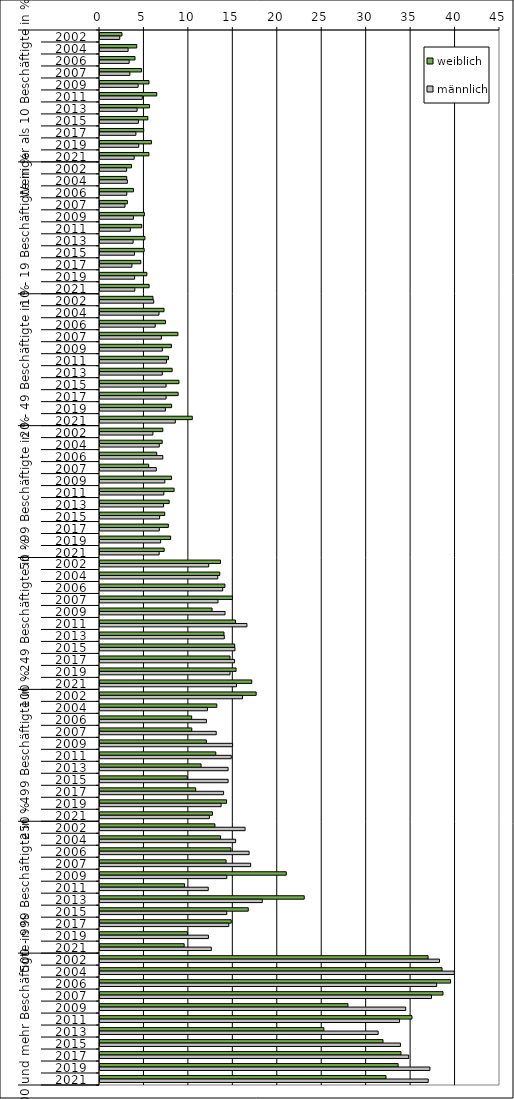
| Category | weiblich | männlich |
|---|---|---|
| 0 | 2.47 | 2.224 |
| 1 | 4.134 | 3.162 |
| 2 | 3.939 | 3.281 |
| 3 | 4.678 | 3.36 |
| 4 | 5.511 | 4.29 |
| 5 | 6.384 | 4.759 |
| 6 | 5.573 | 4.172 |
| 7 | 5.385 | 4.32 |
| 8 | 4.915 | 4.038 |
| 9 | 5.784 | 4.356 |
| 10 | 5.504 | 3.845 |
| 11 | 3.545 | 2.995 |
| 12 | 3.006 | 3.078 |
| 13 | 3.766 | 3.016 |
| 14 | 3.081 | 2.812 |
| 15 | 4.994 | 3.758 |
| 16 | 4.696 | 3.411 |
| 17 | 5.054 | 3.728 |
| 18 | 4.97 | 3.883 |
| 19 | 4.59 | 3.592 |
| 20 | 5.271 | 3.896 |
| 21 | 5.524 | 3.915 |
| 22 | 5.956 | 6.043 |
| 23 | 7.203 | 6.639 |
| 24 | 7.374 | 6.212 |
| 25 | 8.765 | 6.904 |
| 26 | 8.035 | 7.014 |
| 27 | 7.7 | 7.474 |
| 28 | 8.115 | 7.007 |
| 29 | 8.881 | 7.431 |
| 30 | 8.79 | 7.432 |
| 31 | 8.059 | 7.358 |
| 32 | 10.383 | 8.473 |
| 33 | 7.063 | 5.955 |
| 34 | 6.998 | 6.666 |
| 35 | 6.384 | 7.066 |
| 36 | 5.478 | 6.332 |
| 37 | 8.043 | 7.292 |
| 38 | 8.334 | 7.181 |
| 39 | 7.783 | 7.154 |
| 40 | 7.282 | 6.707 |
| 41 | 7.69 | 6.671 |
| 42 | 7.945 | 6.823 |
| 43 | 7.217 | 6.656 |
| 44 | 13.56 | 12.231 |
| 45 | 13.476 | 13.25 |
| 46 | 14.052 | 13.804 |
| 47 | 14.9 | 13.273 |
| 48 | 12.606 | 14.067 |
| 49 | 15.249 | 16.53 |
| 50 | 13.948 | 13.984 |
| 51 | 15.154 | 15.186 |
| 52 | 14.624 | 15.141 |
| 53 | 15.308 | 14.625 |
| 54 | 17.073 | 15.359 |
| 55 | 17.568 | 16.032 |
| 56 | 13.14 | 12.087 |
| 57 | 10.314 | 11.972 |
| 58 | 10.327 | 13.075 |
| 59 | 11.962 | 14.919 |
| 60 | 13.027 | 14.767 |
| 61 | 11.371 | 14.411 |
| 62 | 9.813 | 14.414 |
| 63 | 10.768 | 13.905 |
| 64 | 14.236 | 13.627 |
| 65 | 12.654 | 12.306 |
| 66 | 12.927 | 16.322 |
| 67 | 13.565 | 15.258 |
| 68 | 14.733 | 16.776 |
| 69 | 14.182 | 16.948 |
| 70 | 20.956 | 14.265 |
| 71 | 9.514 | 12.18 |
| 72 | 22.975 | 18.254 |
| 73 | 16.679 | 14.262 |
| 74 | 14.763 | 14.491 |
| 75 | 9.857 | 12.2 |
| 76 | 9.469 | 12.523 |
| 77 | 36.911 | 38.197 |
| 78 | 38.479 | 39.86 |
| 79 | 39.44 | 37.873 |
| 80 | 38.589 | 37.296 |
| 81 | 27.892 | 34.395 |
| 82 | 35.098 | 33.698 |
| 83 | 25.183 | 31.291 |
| 84 | 31.838 | 33.798 |
| 85 | 33.859 | 34.731 |
| 86 | 33.538 | 37.115 |
| 87 | 32.175 | 36.923 |